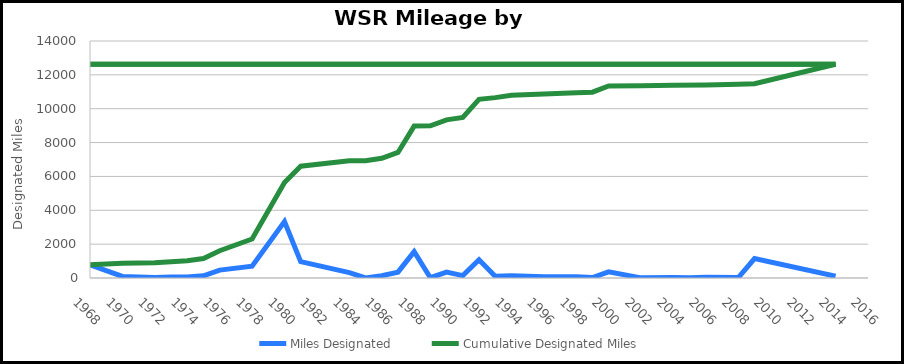
| Category | Miles Designated |
|---|---|
| 1968.0 | 775.2 |
| 1970.0 | 92.5 |
| 1972.0 | 27 |
| 1973.0 | 66 |
| 1974.0 | 58.7 |
| 1975.0 | 127.3 |
| 1976.0 | 464.8 |
| 1978.0 | 693.1 |
| 1980.0 | 3335 |
| 1981.0 | 967 |
| 1984.0 | 316.9 |
| 1985.0 | 7.6 |
| 1986.0 | 138.7 |
| 1987.0 | 346.5 |
| 1988.0 | 1558.5 |
| 1989.0 | 17.1 |
| 1990.0 | 348.4 |
| 1991.0 | 143 |
| 1992.0 | 1073.9 |
| 1993.0 | 98.1 |
| 1994.0 | 134.1 |
| 1996.0 | 79.6 |
| 1998.0 | 81 |
| 1999.0 | 29 |
| 2000.0 | 362.9 |
| 2002.0 | 8.9 |
| 2004.0 | 34.8 |
| 2005.0 | 20 |
| 2006.0 | 45.2 |
| 2008.0 | 25.3 |
| 2009.0 | 1150.7 |
| 2014.0 | 106.7 |